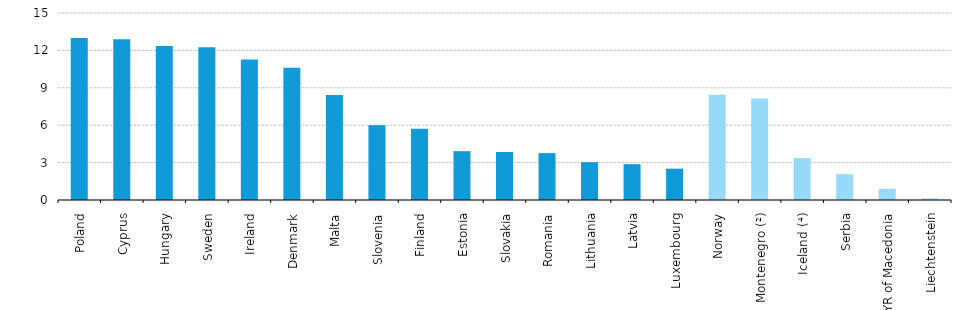
| Category | Series 0 |
|---|---|
| Poland | 12.992 |
| Cyprus | 12.884 |
| Hungary | 12.351 |
| Sweden | 12.261 |
| Ireland | 11.276 |
| Denmark | 10.608 |
| Malta | 8.428 |
| Slovenia | 6.005 |
| Finland | 5.711 |
| Estonia | 3.919 |
| Slovakia | 3.852 |
| Romania | 3.762 |
| Lithuania | 3.034 |
| Latvia | 2.876 |
| Luxembourg | 2.514 |
| Norway | 8.451 |
| Montenegro (²) | 8.143 |
| Iceland (⁴) | 3.366 |
| Serbia | 2.075 |
| FYR of Macedonia | 0.9 |
| Liechtenstein | 0.13 |